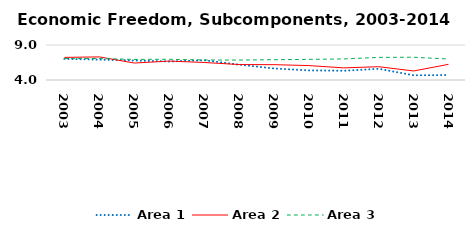
| Category | Area 1 | Area 2 | Area 3 |
|---|---|---|---|
| 2003.0 | 7.022 | 7.228 | 7.078 |
| 2004.0 | 6.913 | 7.301 | 7.072 |
| 2005.0 | 6.789 | 6.421 | 6.941 |
| 2006.0 | 6.643 | 6.704 | 6.964 |
| 2007.0 | 6.823 | 6.504 | 6.86 |
| 2008.0 | 6.193 | 6.21 | 6.848 |
| 2009.0 | 5.651 | 6.188 | 6.903 |
| 2010.0 | 5.371 | 6.062 | 6.945 |
| 2011.0 | 5.323 | 5.733 | 7.009 |
| 2012.0 | 5.598 | 5.901 | 7.229 |
| 2013.0 | 4.675 | 5.29 | 7.253 |
| 2014.0 | 4.705 | 6.238 | 6.995 |